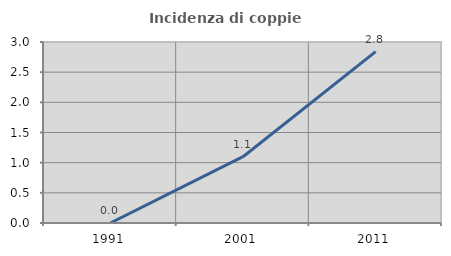
| Category | Incidenza di coppie miste |
|---|---|
| 1991.0 | 0 |
| 2001.0 | 1.099 |
| 2011.0 | 2.841 |